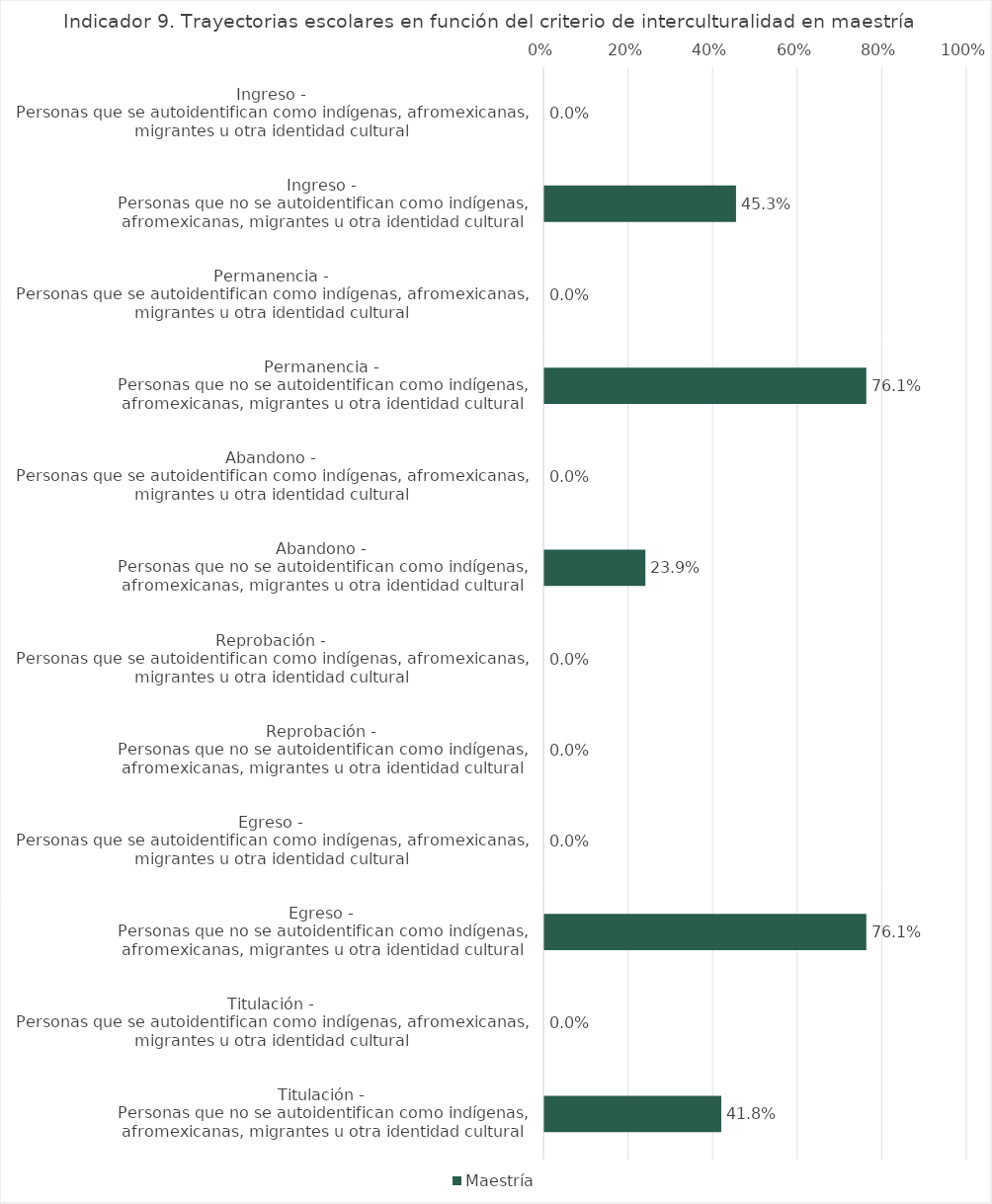
| Category | Maestría |
|---|---|
| Ingreso - 
Personas que se autoidentifican como indígenas, afromexicanas, migrantes u otra identidad cultural | 0 |
| Ingreso - 
Personas que no se autoidentifican como indígenas, afromexicanas, migrantes u otra identidad cultural | 0.453 |
| Permanencia - 
Personas que se autoidentifican como indígenas, afromexicanas, migrantes u otra identidad cultural | 0 |
| Permanencia - 
Personas que no se autoidentifican como indígenas, afromexicanas, migrantes u otra identidad cultural | 0.761 |
| Abandono - 
Personas que se autoidentifican como indígenas, afromexicanas, migrantes u otra identidad cultural | 0 |
| Abandono - 
Personas que no se autoidentifican como indígenas, afromexicanas, migrantes u otra identidad cultural | 0.239 |
| Reprobación - 
Personas que se autoidentifican como indígenas, afromexicanas, migrantes u otra identidad cultural | 0 |
| Reprobación - 
Personas que no se autoidentifican como indígenas, afromexicanas, migrantes u otra identidad cultural | 0 |
| Egreso - 
Personas que se autoidentifican como indígenas, afromexicanas, migrantes u otra identidad cultural | 0 |
| Egreso - 
Personas que no se autoidentifican como indígenas, afromexicanas, migrantes u otra identidad cultural | 0.761 |
| Titulación - 
Personas que se autoidentifican como indígenas, afromexicanas, migrantes u otra identidad cultural | 0 |
| Titulación - 
Personas que no se autoidentifican como indígenas, afromexicanas, migrantes u otra identidad cultural | 0.418 |